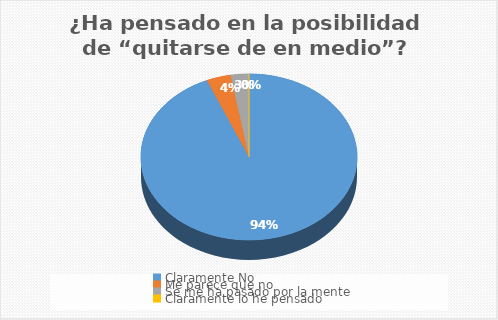
| Category | ¿Ha pensado en la posibilidad de “quitarse de en medio”? |
|---|---|
| Claramente No | 103 |
| Me parece que no | 4 |
| Se me ha pasado por la mente | 3 |
| Claramente lo he pensado | 0 |